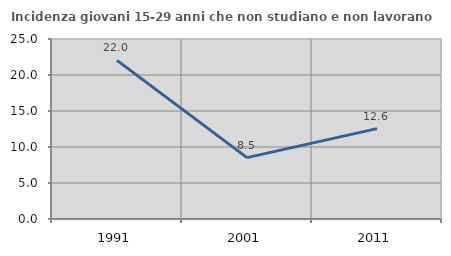
| Category | Incidenza giovani 15-29 anni che non studiano e non lavorano  |
|---|---|
| 1991.0 | 22.033 |
| 2001.0 | 8.52 |
| 2011.0 | 12.551 |